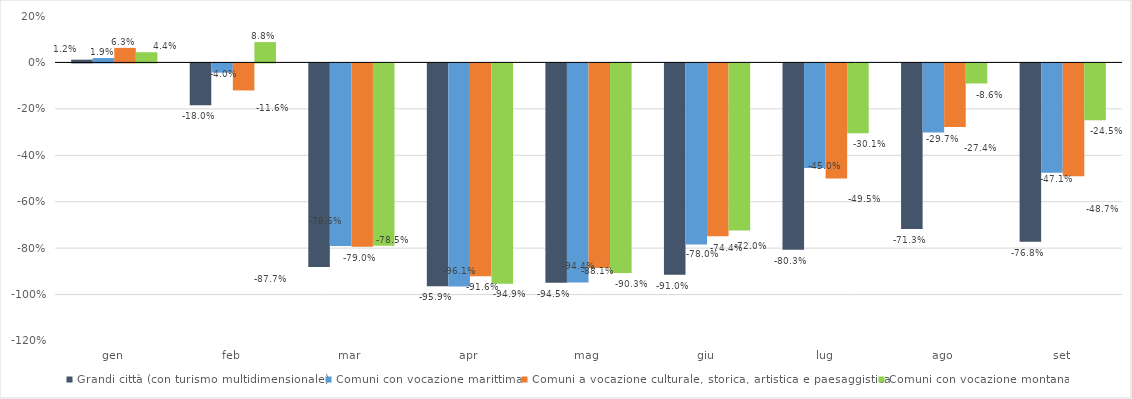
| Category | Grandi città (con turismo multidimensionale) | Comuni con vocazione marittima | Comuni a vocazione culturale, storica, artistica e paesaggistica | Comuni con vocazione montana |
|---|---|---|---|---|
| gen | 1.194 | 1.894 | 6.276 | 4.388 |
| feb | -17.976 | -3.968 | -11.632 | 8.763 |
| mar | -87.732 | -78.622 | -78.951 | -78.509 |
| apr | -95.933 | -96.093 | -91.637 | -94.918 |
| mag | -94.498 | -94.356 | -88.099 | -90.329 |
| giu | -90.98 | -77.979 | -74.43 | -71.976 |
| lug | -80.312 | -45.044 | -49.546 | -30.128 |
| ago | -71.278 | -29.732 | -27.418 | -8.648 |
| set | -76.762 | -47.134 | -48.651 | -24.5 |